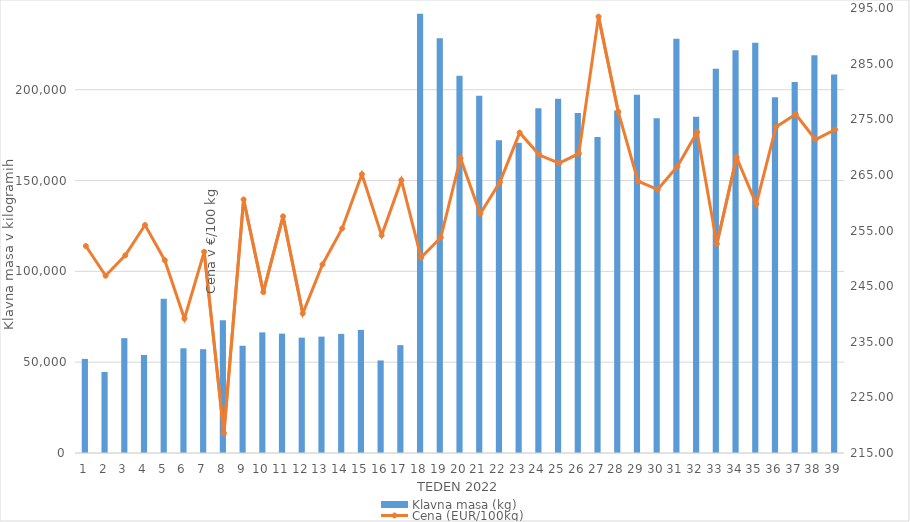
| Category | Klavna masa (kg) |
|---|---|
| 1.0 | 51818 |
| 2.0 | 44619 |
| 3.0 | 63233 |
| 4.0 | 53993 |
| 5.0 | 84871 |
| 6.0 | 57648 |
| 7.0 | 57159 |
| 8.0 | 73139 |
| 9.0 | 59056 |
| 10.0 | 66417 |
| 11.0 | 65723 |
| 12.0 | 63530 |
| 13.0 | 64069 |
| 14.0 | 65564 |
| 15.0 | 67787 |
| 16.0 | 50958 |
| 17.0 | 59387 |
| 18.0 | 241833 |
| 19.0 | 228389 |
| 20.0 | 207661 |
| 21.0 | 196732 |
| 22.0 | 172190 |
| 23.0 | 170751 |
| 24.0 | 189775 |
| 25.0 | 195029 |
| 26.0 | 187239 |
| 27.0 | 173967 |
| 28.0 | 188601 |
| 29.0 | 197293 |
| 30.0 | 184259 |
| 31.0 | 228023 |
| 32.0 | 185079 |
| 33.0 | 211612 |
| 34.0 | 221748 |
| 35.0 | 225927 |
| 36.0 | 195924 |
| 37.0 | 204224 |
| 38.0 | 218966 |
| 39.0 | 208403 |